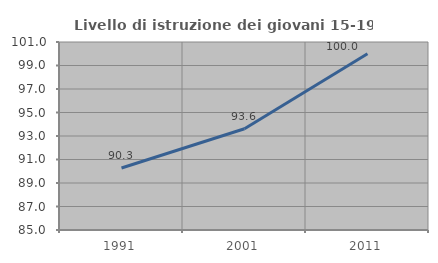
| Category | Livello di istruzione dei giovani 15-19 anni |
|---|---|
| 1991.0 | 90.278 |
| 2001.0 | 93.617 |
| 2011.0 | 100 |